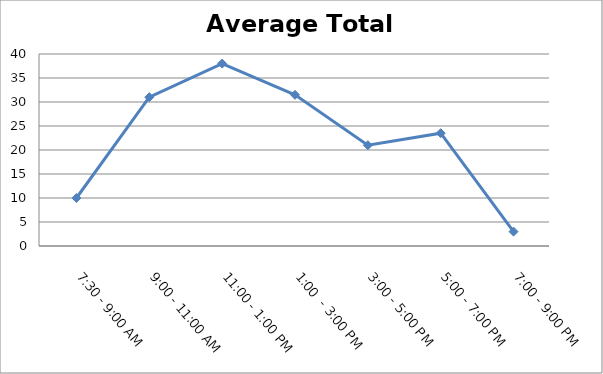
| Category | Total |
|---|---|
| 7:30 - 9:00 AM | 10 |
| 9:00 - 11:00 AM | 31 |
| 11:00 - 1:00 PM | 38 |
| 1:00  - 3:00 PM | 31.5 |
| 3:00 - 5:00 PM | 21 |
| 5:00 - 7:00 PM | 23.5 |
| 7:00 - 9:00 PM | 3 |